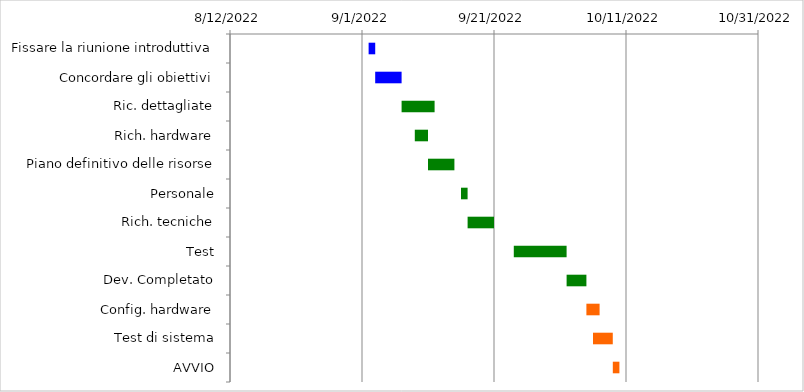
| Category | Inizio | Giorni |
|---|---|---|
| Fissare la riunione introduttiva | 9/2/22 | 1 |
| Concordare gli obiettivi | 9/3/22 | 4 |
| Ric. dettagliate | 9/7/22 | 5 |
| Rich. hardware | 9/9/22 | 2 |
| Piano definitivo delle risorse | 9/11/22 | 4 |
| Personale | 9/16/22 | 1 |
| Rich. tecniche | 9/17/22 | 4 |
| Test | 9/24/22 | 8 |
| Dev. Completato | 10/2/22 | 3 |
| Config. hardware | 10/5/22 | 2 |
| Test di sistema | 10/6/22 | 3 |
| AVVIO | 10/9/22 | 1 |